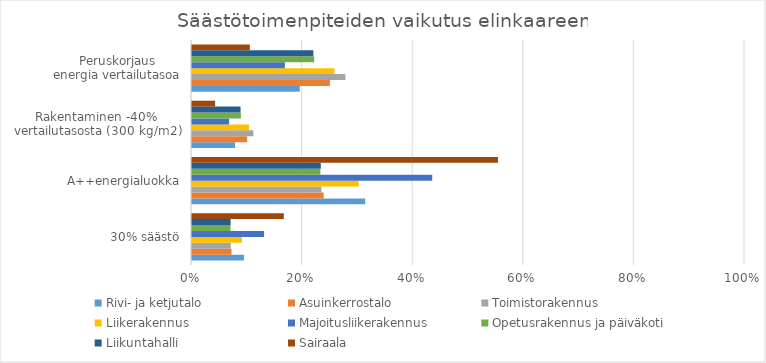
| Category | Rivi- ja ketjutalo | Asuinkerrostalo | Toimistorakennus | Liikerakennus | Majoitusliikerakennus | Opetusrakennus ja päiväkoti | Liikuntahalli | Sairaala |
|---|---|---|---|---|---|---|---|---|
| 30% säästö | 0.094 | 0.071 | 0.07 | 0.09 | 0.13 | 0.07 | 0.07 | 0.166 |
| A++energialuokka | 0.313 | 0.238 | 0.234 | 0.302 | 0.434 | 0.232 | 0.233 | 0.553 |
| Rakentaminen -40% 
vertailutasosta (300 kg/m2) | 0.078 | 0.1 | 0.111 | 0.103 | 0.067 | 0.088 | 0.088 | 0.042 |
| Peruskorjaus
energia vertailutasoa | 0.195 | 0.249 | 0.277 | 0.258 | 0.168 | 0.221 | 0.219 | 0.105 |